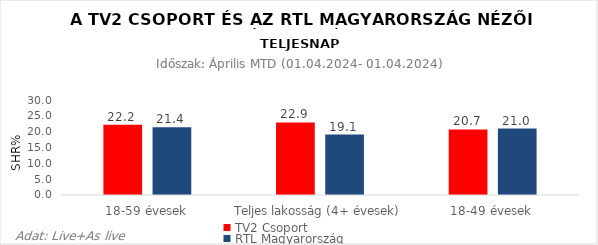
| Category | TV2 Csoport | RTL Magyarország |
|---|---|---|
| 18-59 évesek | 22.2 | 21.4 |
| Teljes lakosság (4+ évesek) | 22.9 | 19.1 |
| 18-49 évesek | 20.7 | 21 |